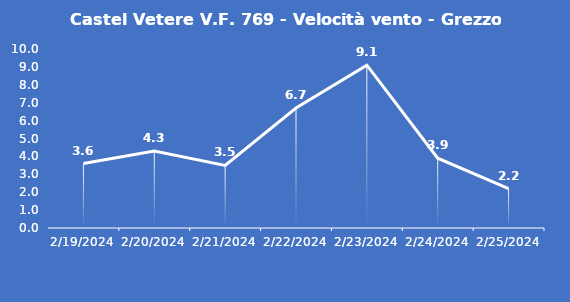
| Category | Castel Vetere V.F. 769 - Velocità vento - Grezzo (m/s) |
|---|---|
| 2/19/24 | 3.6 |
| 2/20/24 | 4.3 |
| 2/21/24 | 3.5 |
| 2/22/24 | 6.7 |
| 2/23/24 | 9.1 |
| 2/24/24 | 3.9 |
| 2/25/24 | 2.2 |